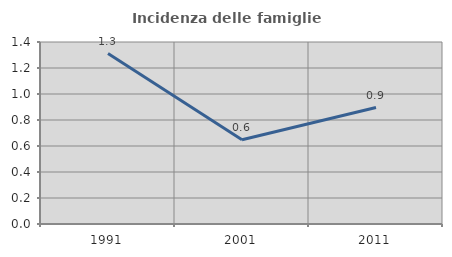
| Category | Incidenza delle famiglie numerose |
|---|---|
| 1991.0 | 1.311 |
| 2001.0 | 0.648 |
| 2011.0 | 0.896 |